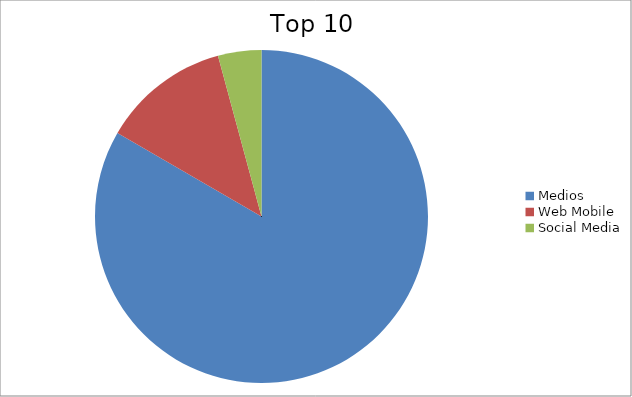
| Category | Series 0 |
|---|---|
| Medios | 83.36 |
| Web Mobile | 12.43 |
| Social Media | 4.21 |